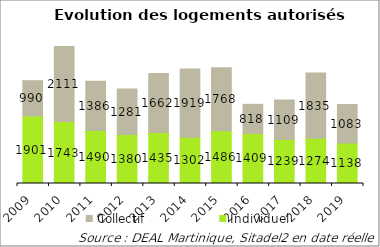
| Category | Individuel | Collectif |
|---|---|---|
| 2009.0 | 1901 | 990 |
| 2010.0 | 1743 | 2111 |
| 2011.0 | 1490 | 1386 |
| 2012.0 | 1380 | 1281 |
| 2013.0 | 1435 | 1662 |
| 2014.0 | 1302 | 1919 |
| 2015.0 | 1486 | 1768 |
| 2016.0 | 1409 | 818 |
| 2017.0 | 1239 | 1109 |
| 2018.0 | 1274 | 1835 |
| 2019.0 | 1138 | 1083 |